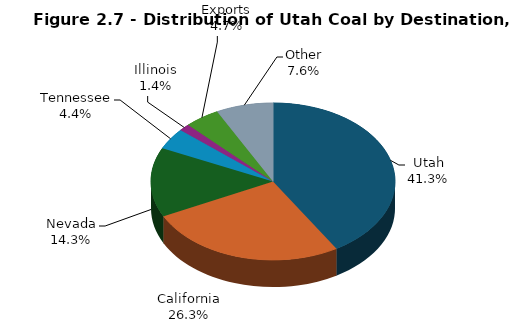
| Category | Series 0 |
|---|---|
| Utah | 10080 |
| California | 6426 |
| Nevada | 3484 |
| Tennessee | 1072 |
| Illinois | 345 |
| Exports | 1142 |
| Other | 1843 |